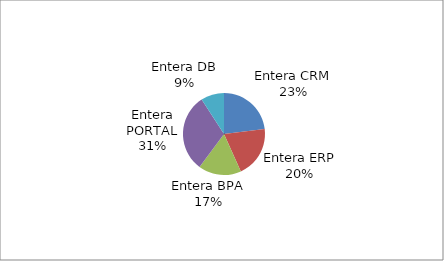
| Category | Series 0 |
|---|---|
| Entera CRM | 2509 |
| Entera ERP | 2200 |
| Entera BPA | 1843 |
| Entera PORTAL | 3336 |
| Entera DB | 998 |